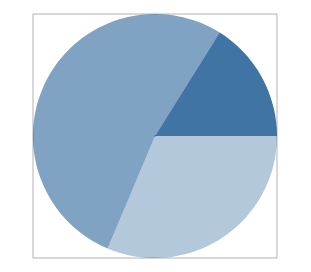
| Category | 2Xcnbp |
|---|---|
| Class I 0-20 | 37 |
| Class II 21-50 | 62 |
| Class III 51-100 | 19 |
| Class IV 101-150 | 0 |